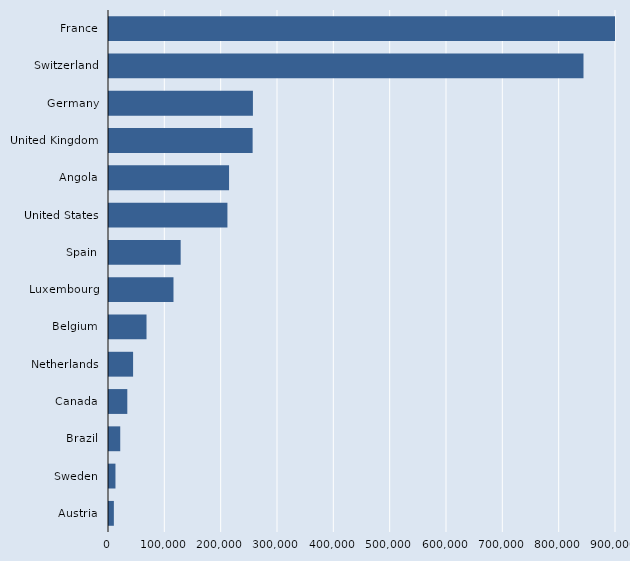
| Category | Series 2 |
|---|---|
| France | 1033120 |
| Switzerland | 842290 |
| Germany | 255470 |
| United Kingdom | 254960 |
| Angola | 213120 |
| United States | 210220 |
| Spain | 127220 |
| Luxembourg | 114470 |
| Belgium | 66600 |
| Netherlands | 42760 |
| Canada | 32490 |
| Brazil | 19950 |
| Sweden | 11470 |
| Austria | 8630 |